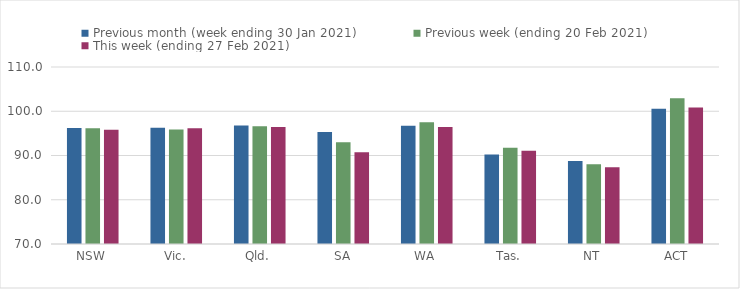
| Category | Previous month (week ending 30 Jan 2021) | Previous week (ending 20 Feb 2021) | This week (ending 27 Feb 2021) |
|---|---|---|---|
| NSW | 96.23 | 96.16 | 95.84 |
| Vic. | 96.28 | 95.87 | 96.17 |
| Qld. | 96.79 | 96.62 | 96.45 |
| SA | 95.3 | 93.02 | 90.76 |
| WA | 96.7 | 97.5 | 96.42 |
| Tas. | 90.25 | 91.75 | 91.1 |
| NT | 88.73 | 88.03 | 87.37 |
| ACT | 100.59 | 102.93 | 100.82 |